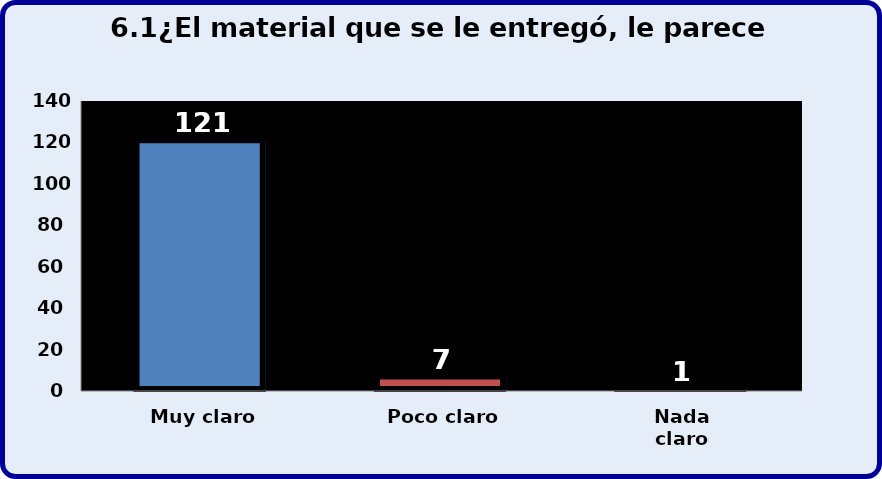
| Category | Series 0 |
|---|---|
| Muy claro | 121 |
| Poco claro | 7 |
| Nada claro | 1 |